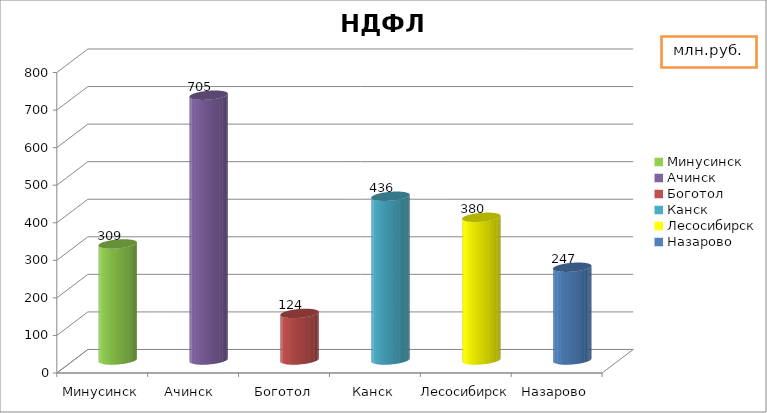
| Category | НДФЛ |
|---|---|
| Минусинск | 309 |
| Ачинск  | 705 |
| Боготол | 124 |
| Канск | 436 |
| Лесосибирск | 380 |
| Назарово | 247 |